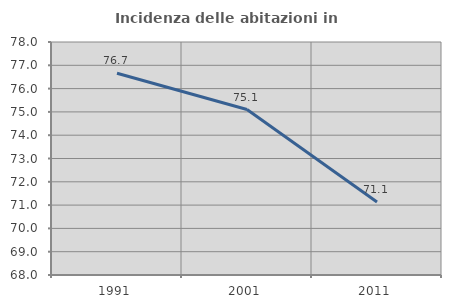
| Category | Incidenza delle abitazioni in proprietà  |
|---|---|
| 1991.0 | 76.659 |
| 2001.0 | 75.101 |
| 2011.0 | 71.136 |